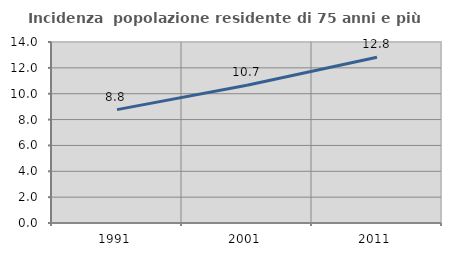
| Category | Incidenza  popolazione residente di 75 anni e più |
|---|---|
| 1991.0 | 8.769 |
| 2001.0 | 10.652 |
| 2011.0 | 12.815 |